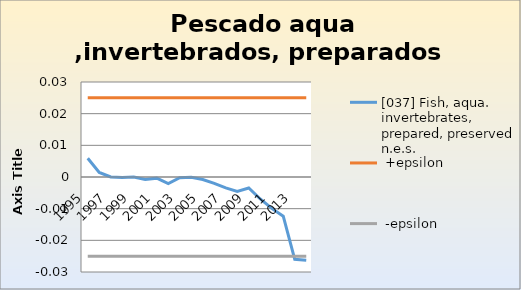
| Category | [037] Fish, aqua. invertebrates, prepared, preserved, n.e.s. |  +epsilon |  -epsilon |
|---|---|---|---|
| 1995.0 | 0.006 | 0.025 | -0.025 |
| 1996.0 | 0.001 | 0.025 | -0.025 |
| 1997.0 | 0 | 0.025 | -0.025 |
| 1998.0 | 0 | 0.025 | -0.025 |
| 1999.0 | 0 | 0.025 | -0.025 |
| 2000.0 | -0.001 | 0.025 | -0.025 |
| 2001.0 | 0 | 0.025 | -0.025 |
| 2002.0 | -0.002 | 0.025 | -0.025 |
| 2003.0 | 0 | 0.025 | -0.025 |
| 2004.0 | 0 | 0.025 | -0.025 |
| 2005.0 | -0.001 | 0.025 | -0.025 |
| 2006.0 | -0.002 | 0.025 | -0.025 |
| 2007.0 | -0.003 | 0.025 | -0.025 |
| 2008.0 | -0.005 | 0.025 | -0.025 |
| 2009.0 | -0.003 | 0.025 | -0.025 |
| 2010.0 | -0.007 | 0.025 | -0.025 |
| 2011.0 | -0.01 | 0.025 | -0.025 |
| 2012.0 | -0.012 | 0.025 | -0.025 |
| 2013.0 | -0.026 | 0.025 | -0.025 |
| 2014.0 | -0.026 | 0.025 | -0.025 |